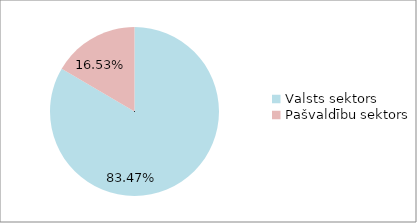
| Category | Series 0 |
|---|---|
| Valsts sektors | 0.835 |
| Pašvaldību sektors | 0.165 |